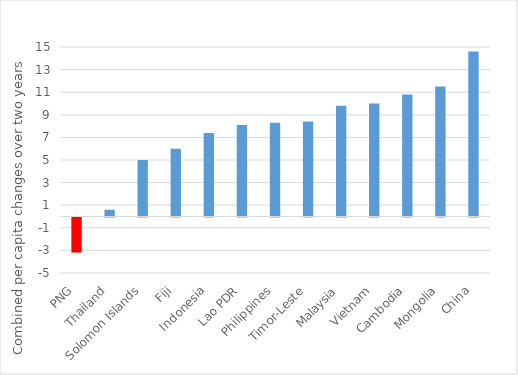
| Category | 2014 and 2015 combined per capita income (private consumption, non-resource GDP or GDP) changes |
|---|---|
| PNG | -3.1 |
| Thailand | 0.6 |
| Solomon Islands | 5 |
| Fiji | 6 |
| Indonesia | 7.4 |
| Lao PDR | 8.1 |
| Philippines | 8.3 |
| Timor-Leste | 8.4 |
| Malaysia | 9.8 |
| Vietnam | 10 |
| Cambodia | 10.8 |
| Mongolia | 11.5 |
| China | 14.6 |